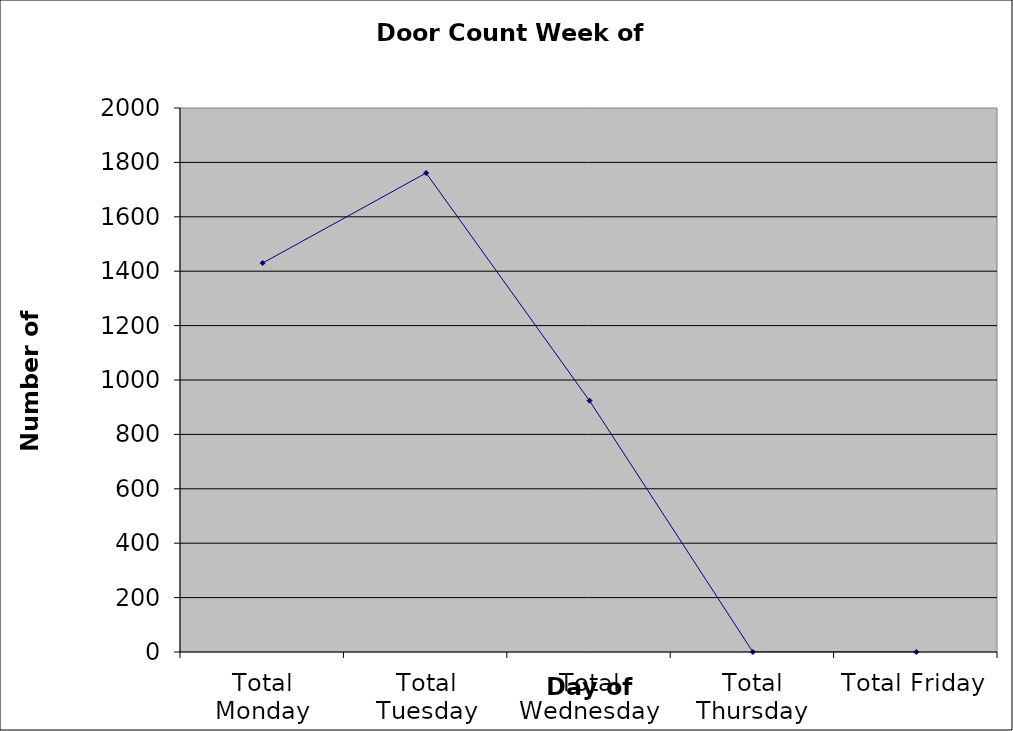
| Category | Series 0 |
|---|---|
| Total Monday | 1430 |
| Total Tuesday | 1761 |
| Total Wednesday | 924 |
| Total Thursday | 0 |
| Total Friday | 0 |